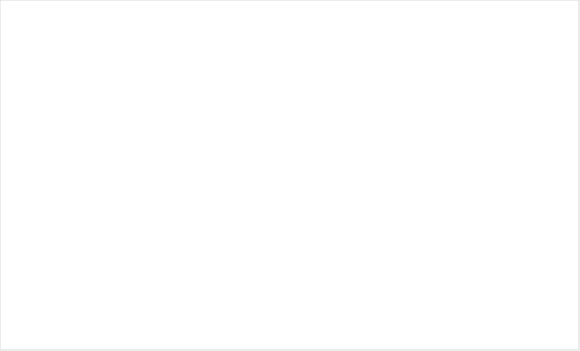
| Category | Итог |
|---|---|
| Ні | 14 |
| Так | 2 |